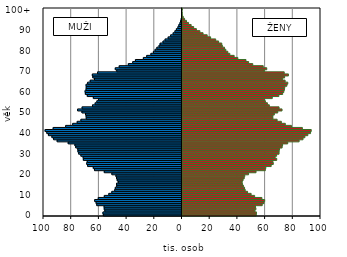
| Category | -5 186 330  | 5 367 513  |
|---|---|---|
| 0 | -56803 | 53974 |
| 1 | -57075 | 54110 |
| 2 | -55721 | 52979 |
| 3 | -56156 | 53712 |
| 4 | -56257 | 53407 |
| 5 | -61556 | 58289 |
| 6 | -62019 | 59560 |
| 7 | -63056 | 60043 |
| 8 | -60457 | 58067 |
| 9 | -56106 | 52804 |
| 10 | -52851 | 50268 |
| 11 | -50674 | 47719 |
| 12 | -48577 | 45982 |
| 13 | -48154 | 45528 |
| 14 | -47147 | 44665 |
| 15 | -47228 | 43955 |
| 16 | -46000 | 43772 |
| 17 | -46769 | 44407 |
| 18 | -47263 | 45257 |
| 19 | -47696 | 45656 |
| 20 | -50641 | 48424 |
| 21 | -56118 | 53822 |
| 22 | -63178 | 60515 |
| 23 | -64057 | 60881 |
| 24 | -68132 | 64754 |
| 25 | -68810 | 66269 |
| 26 | -68414 | 65981 |
| 27 | -71227 | 68739 |
| 28 | -71388 | 67588 |
| 29 | -73005 | 68683 |
| 30 | -74595 | 70432 |
| 31 | -75140 | 70492 |
| 32 | -75247 | 70785 |
| 33 | -76721 | 72648 |
| 34 | -77317 | 72991 |
| 35 | -82169 | 76685 |
| 36 | -90149 | 84918 |
| 37 | -92721 | 87745 |
| 38 | -93938 | 89093 |
| 39 | -96436 | 91232 |
| 40 | -97618 | 93182 |
| 41 | -98857 | 93680 |
| 42 | -93031 | 87275 |
| 43 | -84005 | 79408 |
| 44 | -78923 | 74962 |
| 45 | -75668 | 72095 |
| 46 | -72997 | 69040 |
| 47 | -69150 | 65993 |
| 48 | -69231 | 65971 |
| 49 | -69668 | 67019 |
| 50 | -72240 | 69492 |
| 51 | -75380 | 72586 |
| 52 | -72127 | 70448 |
| 53 | -64634 | 63421 |
| 54 | -62715 | 62019 |
| 55 | -61480 | 60579 |
| 56 | -60258 | 60018 |
| 57 | -64018 | 65555 |
| 58 | -68399 | 70304 |
| 59 | -69783 | 73045 |
| 60 | -69968 | 73875 |
| 61 | -69268 | 74323 |
| 62 | -69157 | 74571 |
| 63 | -69245 | 76085 |
| 64 | -68124 | 76742 |
| 65 | -66274 | 74810 |
| 66 | -63184 | 72818 |
| 67 | -64403 | 74443 |
| 68 | -64738 | 77205 |
| 69 | -60945 | 74172 |
| 70 | -47103 | 59739 |
| 71 | -48175 | 61552 |
| 72 | -45347 | 59002 |
| 73 | -38761 | 51449 |
| 74 | -35576 | 48485 |
| 75 | -33631 | 46550 |
| 76 | -27896 | 40675 |
| 77 | -25477 | 38016 |
| 78 | -22472 | 34884 |
| 79 | -20657 | 33437 |
| 80 | -19425 | 32005 |
| 81 | -18144 | 31023 |
| 82 | -16569 | 29470 |
| 83 | -15791 | 29064 |
| 84 | -13724 | 26790 |
| 85 | -12208 | 24693 |
| 86 | -10005 | 21038 |
| 87 | -8184 | 18540 |
| 88 | -6416 | 15565 |
| 89 | -5103 | 13271 |
| 90 | -4057 | 10746 |
| 91 | -2958 | 8789 |
| 92 | -2292 | 6950 |
| 93 | -1495 | 5111 |
| 94 | -1071 | 3617 |
| 95 | -585 | 2214 |
| 96 | -326 | 1248 |
| 97 | -129 | 452 |
| 98 | -72 | 371 |
| 99 | -56 | 236 |
| 100+ | -169 | 564 |